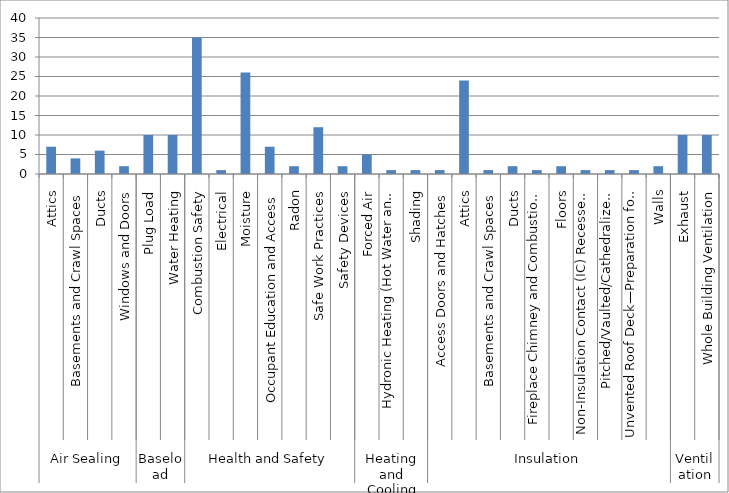
| Category | Series 0 |
|---|---|
| 0 | 7 |
| 1 | 4 |
| 2 | 6 |
| 3 | 2 |
| 4 | 10 |
| 5 | 10 |
| 6 | 35 |
| 7 | 1 |
| 8 | 26 |
| 9 | 7 |
| 10 | 2 |
| 11 | 12 |
| 12 | 2 |
| 13 | 5 |
| 14 | 1 |
| 15 | 1 |
| 16 | 1 |
| 17 | 24 |
| 18 | 1 |
| 19 | 2 |
| 20 | 1 |
| 21 | 2 |
| 22 | 1 |
| 23 | 1 |
| 24 | 1 |
| 25 | 2 |
| 26 | 10 |
| 27 | 10 |